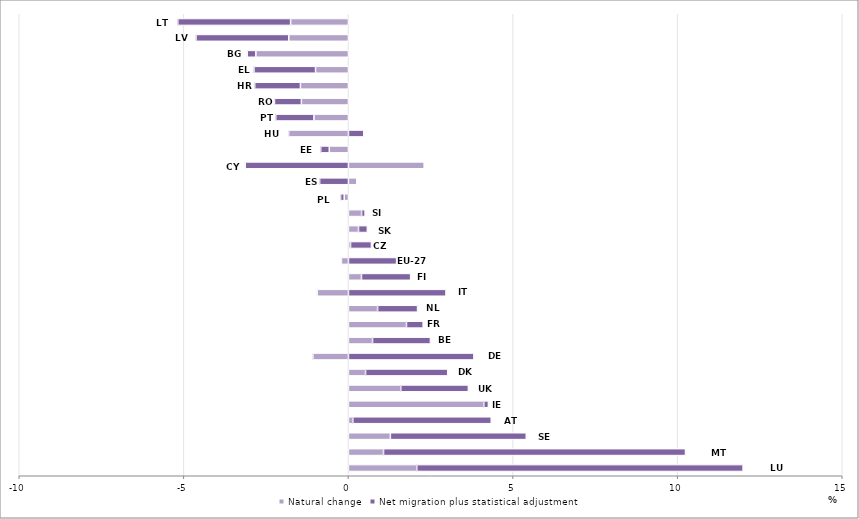
| Category | Natural change | Net migration plus statistical adjustment  |
|---|---|---|
| LU | 2.074 | 9.915 |
| MT | 1.065 | 9.174 |
| SE | 1.274 | 4.129 |
| AT | 0.132 | 4.206 |
| IE | 4.111 | 0.14 |
| UK | 1.589 | 2.055 |
| DK | 0.519 | 2.496 |
| DE | -1.08 | 3.811 |
| BE | 0.732 | 1.759 |
| FR | 1.763 | 0.507 |
| NL | 0.885 | 1.214 |
| IT | -0.95 | 2.963 |
| FI | 0.396 | 1.493 |
| EU-27 | -0.214 | 1.462 |
| CZ | 0.064 | 0.635 |
| SK | 0.305 | 0.269 |
| SI | 0.399 | 0.107 |
| PL | -0.129 | -0.11 |
| ES | 0.254 | -0.876 |
| CY | 2.3 | -3.136 |
| EE | -0.582 | -0.262 |
| HU | -1.818 | 0.465 |
| PT | -1.048 | -1.16 |
| RO | -1.429 | -0.818 |
| HR | -1.459 | -1.389 |
| EL | -0.999 | -1.871 |
| BG | -2.812 | -0.264 |
| LV | -1.812 | -2.819 |
| LT | -1.757 | -3.428 |